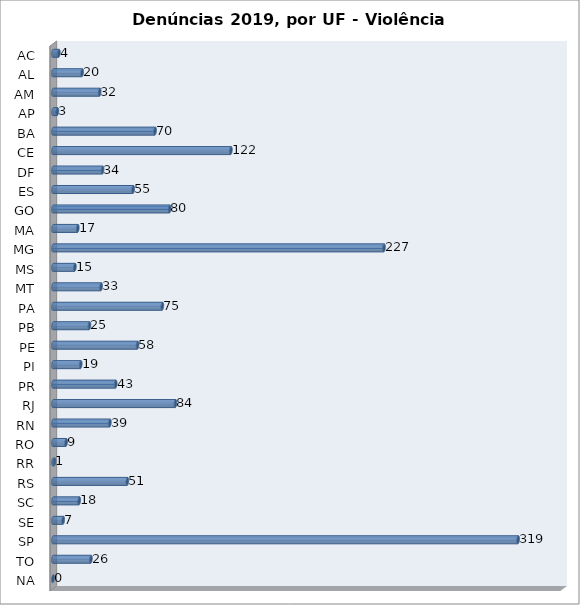
| Category | Series 0 |
|---|---|
| AC | 4 |
| AL | 20 |
| AM | 32 |
| AP | 3 |
| BA | 70 |
| CE | 122 |
| DF | 34 |
| ES | 55 |
| GO | 80 |
| MA | 17 |
| MG | 227 |
| MS | 15 |
| MT | 33 |
| PA | 75 |
| PB | 25 |
| PE | 58 |
| PI | 19 |
| PR | 43 |
| RJ | 84 |
| RN | 39 |
| RO | 9 |
| RR | 1 |
| RS | 51 |
| SC | 18 |
| SE | 7 |
| SP | 319 |
| TO | 26 |
| NA | 0 |